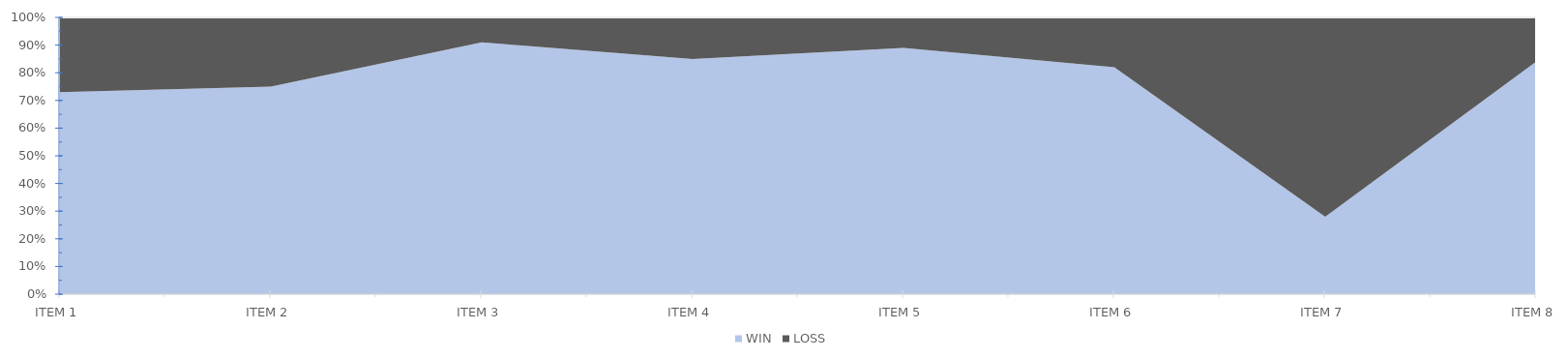
| Category | WIN | LOSS |
|---|---|---|
| ITEM 1 | 0.73 | 0.27 |
| ITEM 2 | 0.75 | 0.25 |
| ITEM 3 | 0.91 | 0.09 |
| ITEM 4 | 0.85 | 0.15 |
| ITEM 5 | 0.89 | 0.11 |
| ITEM 6 | 0.82 | 0.18 |
| ITEM 7 | 0.28 | 0.72 |
| ITEM 8 | 0.84 | 0.16 |